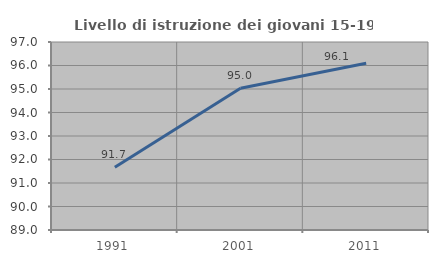
| Category | Livello di istruzione dei giovani 15-19 anni |
|---|---|
| 1991.0 | 91.667 |
| 2001.0 | 95.035 |
| 2011.0 | 96.094 |